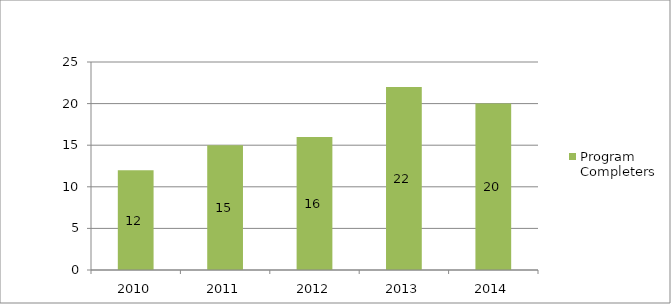
| Category | Program Completers |
|---|---|
| 2010.0 | 12 |
| 2011.0 | 15 |
| 2012.0 | 16 |
| 2013.0 | 22 |
| 2014.0 | 20 |